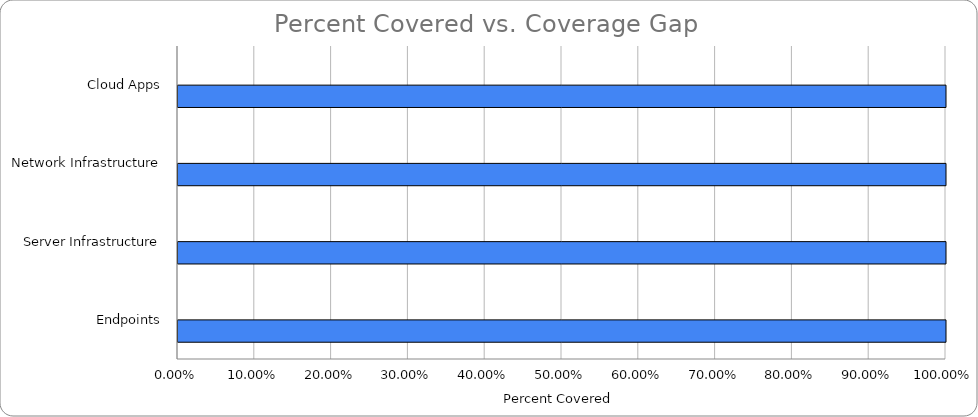
| Category | Series 0 | Series 1 |
|---|---|---|
| Cloud Apps | 0 | 1 |
| Network Infrastructure | 0 | 1 |
| Server Infrastructure | 0 | 1 |
| Endpoints | 0 | 1 |